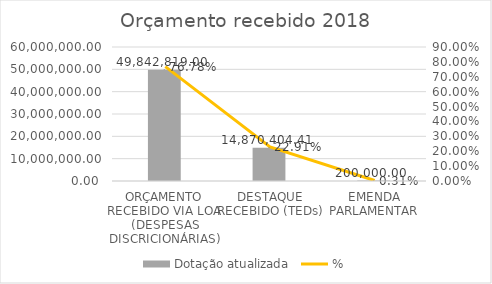
| Category | Dotação atualizada |
|---|---|
| ORÇAMENTO RECEBIDO VIA LOA (DESPESAS DISCRICIONÁRIAS) | 49842819 |
| DESTAQUE RECEBIDO (TEDs) | 14870404.41 |
| EMENDA PARLAMENTAR | 200000 |